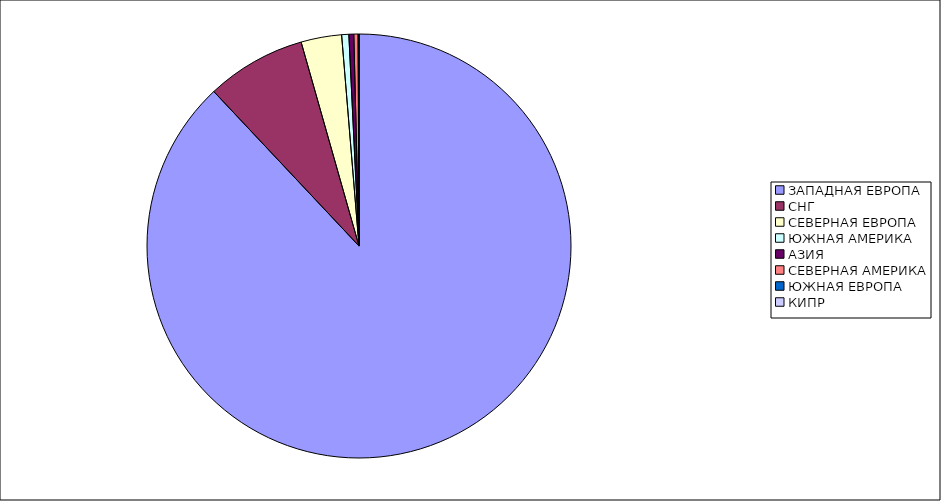
| Category | Оборот |
|---|---|
| ЗАПАДНАЯ ЕВРОПА | 0.88 |
| СНГ | 0.076 |
| СЕВЕРНАЯ ЕВРОПА | 0.031 |
| ЮЖНАЯ АМЕРИКА | 0.005 |
| АЗИЯ | 0.004 |
| СЕВЕРНАЯ АМЕРИКА | 0.003 |
| ЮЖНАЯ ЕВРОПА | 0.001 |
| КИПР | 0 |